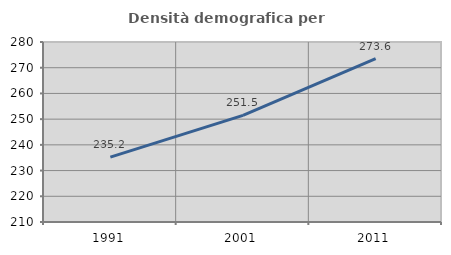
| Category | Densità demografica |
|---|---|
| 1991.0 | 235.212 |
| 2001.0 | 251.461 |
| 2011.0 | 273.576 |